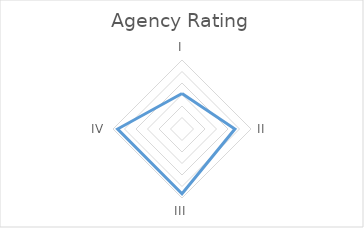
| Category | Series 0 |
|---|---|
| I | 1.545 |
| II | 2.3 |
| III | 2.818 |
| IV | 2.8 |